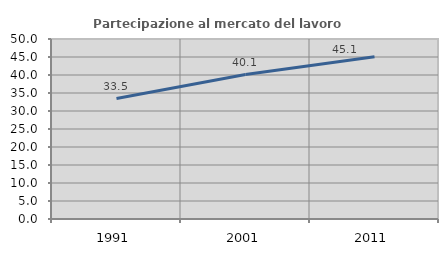
| Category | Partecipazione al mercato del lavoro  femminile |
|---|---|
| 1991.0 | 33.452 |
| 2001.0 | 40.113 |
| 2011.0 | 45.073 |